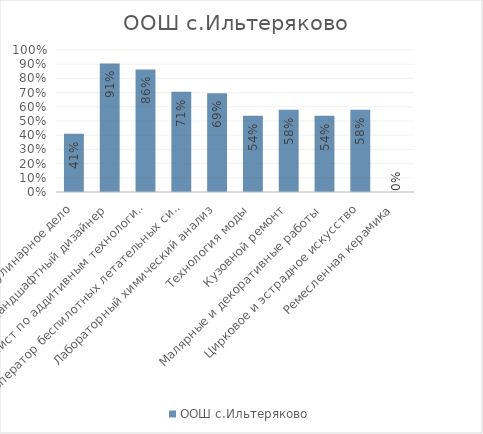
| Category | ООШ с.Ильтеряково |
|---|---|
| Кулинарное дело | 0.411 |
| Ландшафтный дизайнер | 0.905 |
| Специалист по аддитивным технологиям | 0.863 |
| Оператор беспилотных летательных систем | 0.705 |
| Лабораторный химический анализ | 0.695 |
| Технология моды | 0.537 |
| Кузовной ремонт | 0.579 |
| Малярные и декоративные работы | 0.537 |
| Цирковое и эстрадное искусство | 0.579 |
| Ремесленная керамика | 0 |